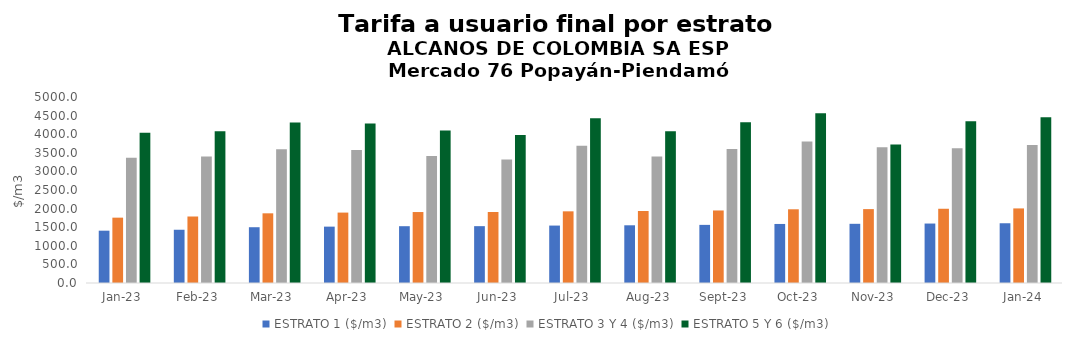
| Category | ESTRATO 1 ($/m3) | ESTRATO 2 ($/m3) | ESTRATO 3 Y 4 ($/m3) | ESTRATO 5 Y 6 ($/m3) |
|---|---|---|---|---|
| 2023-01-01 | 1406.32 | 1756.53 | 3365.49 | 4038.588 |
| 2023-02-01 | 1431.45 | 1787.62 | 3398.26 | 4077.912 |
| 2023-03-01 | 1499.4 | 1873.1 | 3596.1 | 4315.32 |
| 2023-04-01 | 1515.22 | 1892.7 | 3575.22 | 4290.264 |
| 2023-05-01 | 1527.06 | 1907.55 | 3416.65 | 4099.98 |
| 2023-06-01 | 1528.08 | 1909 | 3316.57 | 3979.884 |
| 2023-07-01 | 1543.84 | 1926.61 | 3689.81 | 4427.772 |
| 2023-08-01 | 1551.43 | 1936.32 | 3401.48 | 4081.776 |
| 2023-09-01 | 1562.51 | 1949.77 | 3603.59 | 4324.308 |
| 2023-10-01 | 1587.1 | 1981.56 | 3805.44 | 4566.528 |
| 2023-11-01 | 1591.15 | 1986.35 | 3648.51 | 3721.48 |
| 2023-12-01 | 1598.38 | 1995.68 | 3624.28 | 4349.136 |
| 2024-01-01 | 1605.97 | 2004.9 | 3712.73 | 4455.276 |